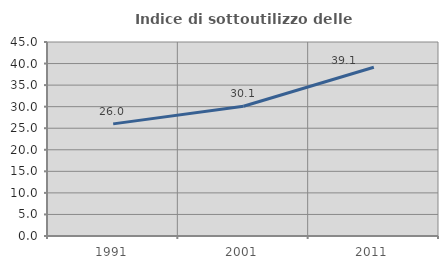
| Category | Indice di sottoutilizzo delle abitazioni  |
|---|---|
| 1991.0 | 26.005 |
| 2001.0 | 30.105 |
| 2011.0 | 39.13 |